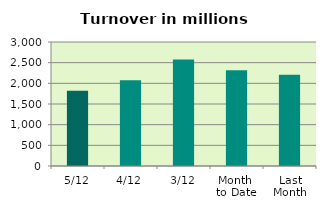
| Category | Series 0 |
|---|---|
| 5/12 | 1821.1 |
| 4/12 | 2076.183 |
| 3/12 | 2573.994 |
| Month 
to Date | 2315.666 |
| Last
Month | 2210.602 |